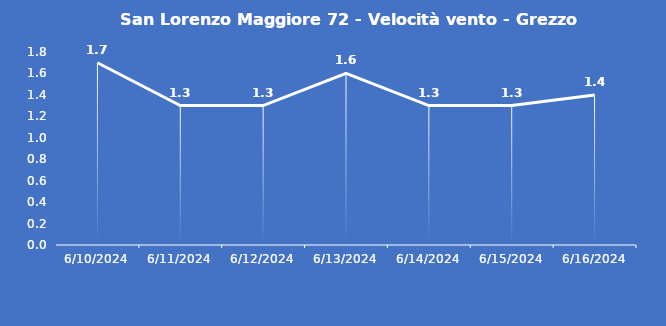
| Category | San Lorenzo Maggiore 72 - Velocità vento - Grezzo (m/s) |
|---|---|
| 6/10/24 | 1.7 |
| 6/11/24 | 1.3 |
| 6/12/24 | 1.3 |
| 6/13/24 | 1.6 |
| 6/14/24 | 1.3 |
| 6/15/24 | 1.3 |
| 6/16/24 | 1.4 |